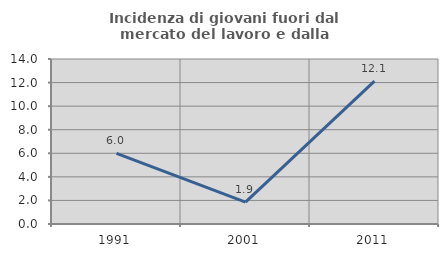
| Category | Incidenza di giovani fuori dal mercato del lavoro e dalla formazione  |
|---|---|
| 1991.0 | 6 |
| 2001.0 | 1.852 |
| 2011.0 | 12.121 |